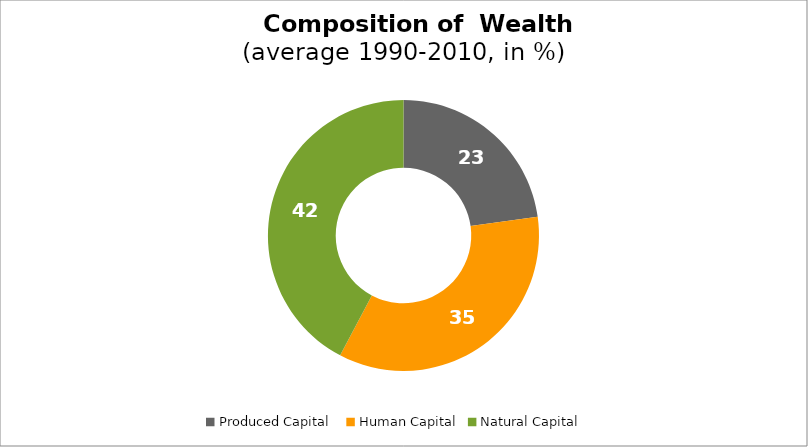
| Category | Series 0 |
|---|---|
| Produced Capital  | 22.784 |
| Human Capital | 34.958 |
| Natural Capital | 42.258 |